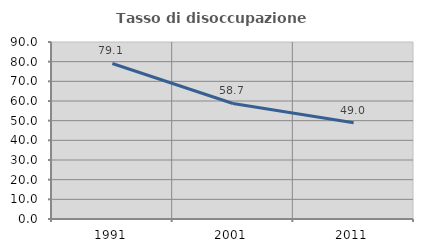
| Category | Tasso di disoccupazione giovanile  |
|---|---|
| 1991.0 | 79.078 |
| 2001.0 | 58.73 |
| 2011.0 | 48.958 |